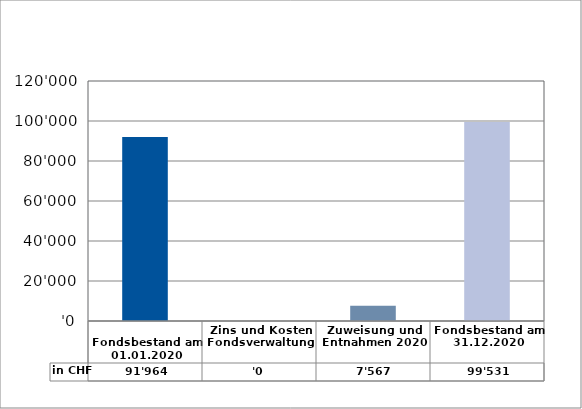
| Category | in CHF |
|---|---|
| 
Fondsbestand am 01.01.2020

 | 91964 |
| Zins und Kosten Fondsverwaltung | 0 |
| Zuweisung und Entnahmen 2020 | 7566.7 |
| Fondsbestand am 31.12.2020 | 99530.7 |